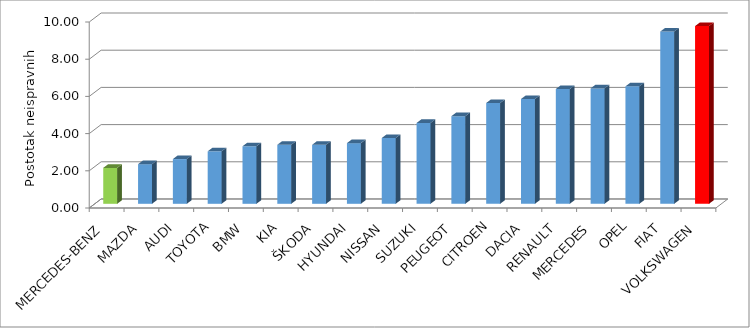
| Category | Series 4 |
|---|---|
| MERCEDES-BENZ | 1.93 |
| MAZDA | 2.13 |
| AUDI | 2.405 |
| TOYOTA | 2.822 |
| BMW | 3.092 |
| KIA | 3.172 |
| ŠKODA | 3.173 |
| HYUNDAI | 3.261 |
| NISSAN | 3.536 |
| SUZUKI | 4.346 |
| PEUGEOT | 4.712 |
| CITROEN | 5.419 |
| DACIA | 5.633 |
| RENAULT | 6.171 |
| MERCEDES | 6.206 |
| OPEL | 6.314 |
| FIAT | 9.26 |
| VOLKSWAGEN | 9.556 |